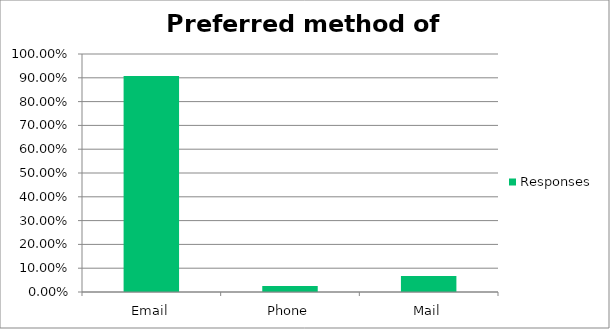
| Category | Responses |
|---|---|
| Email | 0.907 |
| Phone | 0.025 |
| Mail | 0.068 |